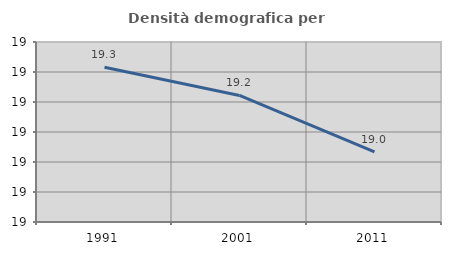
| Category | Densità demografica |
|---|---|
| 1991.0 | 19.316 |
| 2001.0 | 19.222 |
| 2011.0 | 19.034 |